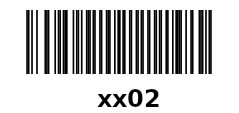
| Category | xx02        |
|---|---|
| Barcode 2 | 0 |